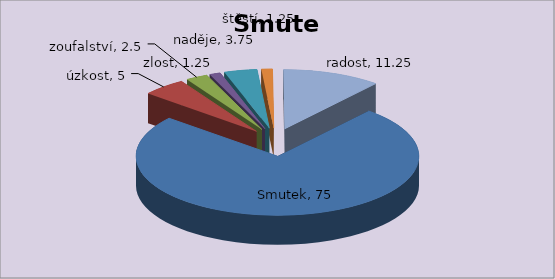
| Category | Smutek |
|---|---|
| Smutek | 75 |
| úzkost | 5 |
| zoufalství | 2.5 |
| zlost | 1.25 |
| naděje | 3.75 |
| štěstí | 1.25 |
| radost | 11.25 |